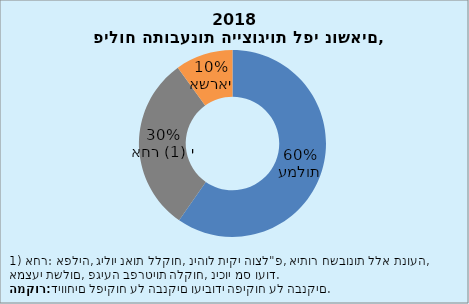
| Category | Series 0 |
|---|---|
| עמלות | 108 |
| אחר (1) י | 55 |
| אשראי | 18 |